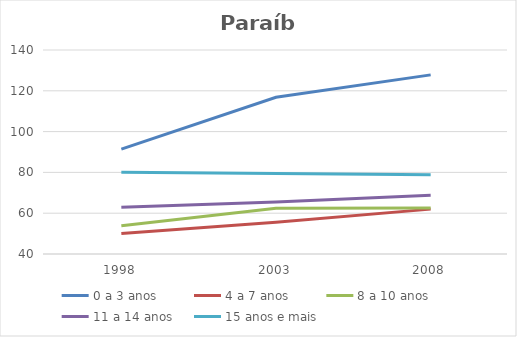
| Category | 0 a 3 anos | 4 a 7 anos | 8 a 10 anos | 11 a 14 anos | 15 anos e mais |
|---|---|---|---|---|---|
| 1998.0 | 91.4 | 50.1 | 53.8 | 62.9 | 80.1 |
| 2003.0 | 116.8 | 55.6 | 62.4 | 65.5 | 79.5 |
| 2008.0 | 127.8 | 62 | 62.6 | 68.8 | 78.8 |